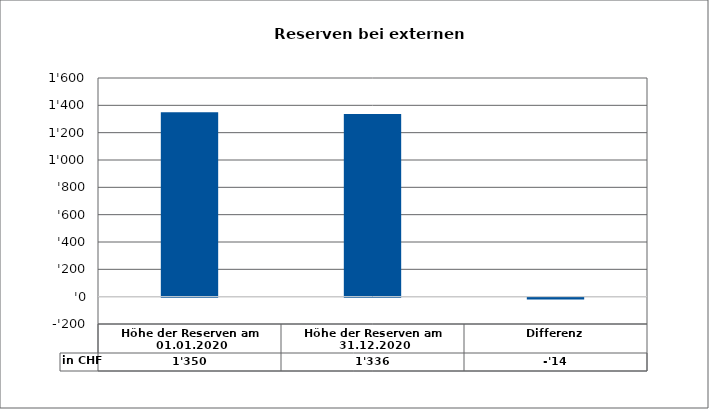
| Category | in CHF |
|---|---|
| Höhe der Reserven am 01.01.2020 | 1350 |
| Höhe der Reserven am 31.12.2020 | 1336 |
| Differenz | -14 |